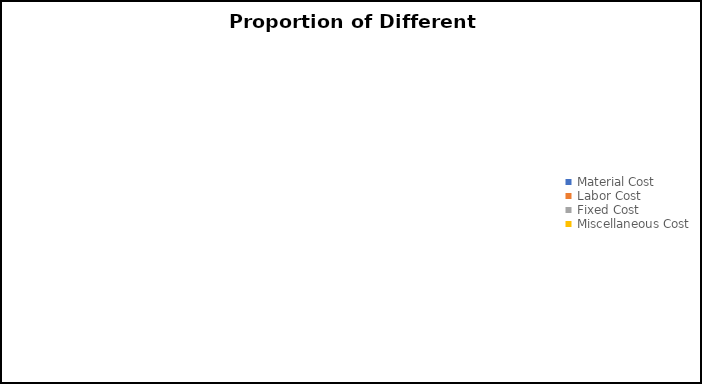
| Category | Series 0 |
|---|---|
| Material Cost | 0 |
| Labor Cost | 0 |
| Fixed Cost | 0 |
| Miscellaneous Cost | 0 |